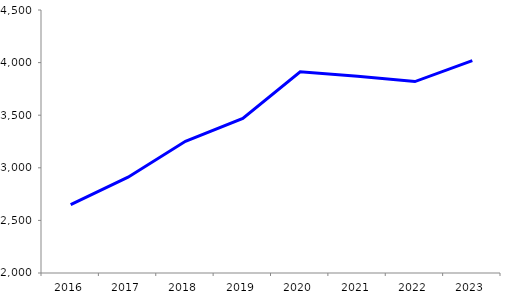
| Category | Nombre d'élèves |
|---|---|
| 2016 | 2649 |
| 2017 | 2911 |
| 2018 | 3252 |
| 2019 | 3470 |
| 2020 | 3913 |
| 2021 | 3871 |
| 2022 | 3820 |
| 2023 | 4018 |